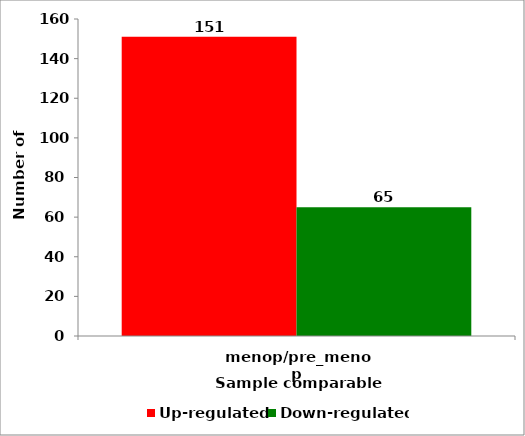
| Category | Up-regulated | Down-regulated |
|---|---|---|
| menop/pre_menop | 151 | 65 |